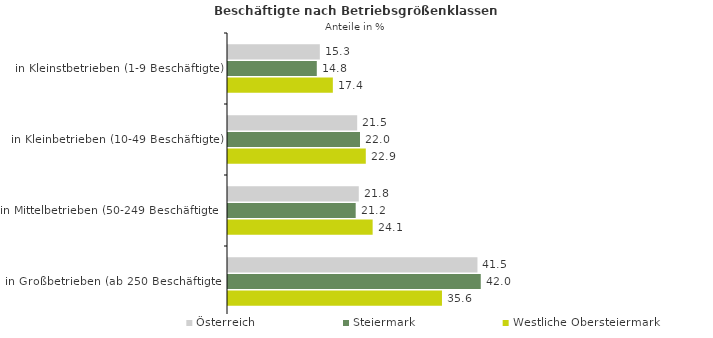
| Category | Österreich | Steiermark | Westliche Obersteiermark |
|---|---|---|---|
| in Kleinstbetrieben (1-9 Beschäftigte) | 15.273 | 14.768 | 17.438 |
| in Kleinbetrieben (10-49 Beschäftigte) | 21.487 | 21.955 | 22.917 |
| in Mittelbetrieben (50-249 Beschäftigte) | 21.75 | 21.237 | 24.057 |
| in Großbetrieben (ab 250 Beschäftigte) | 41.489 | 42.04 | 35.587 |